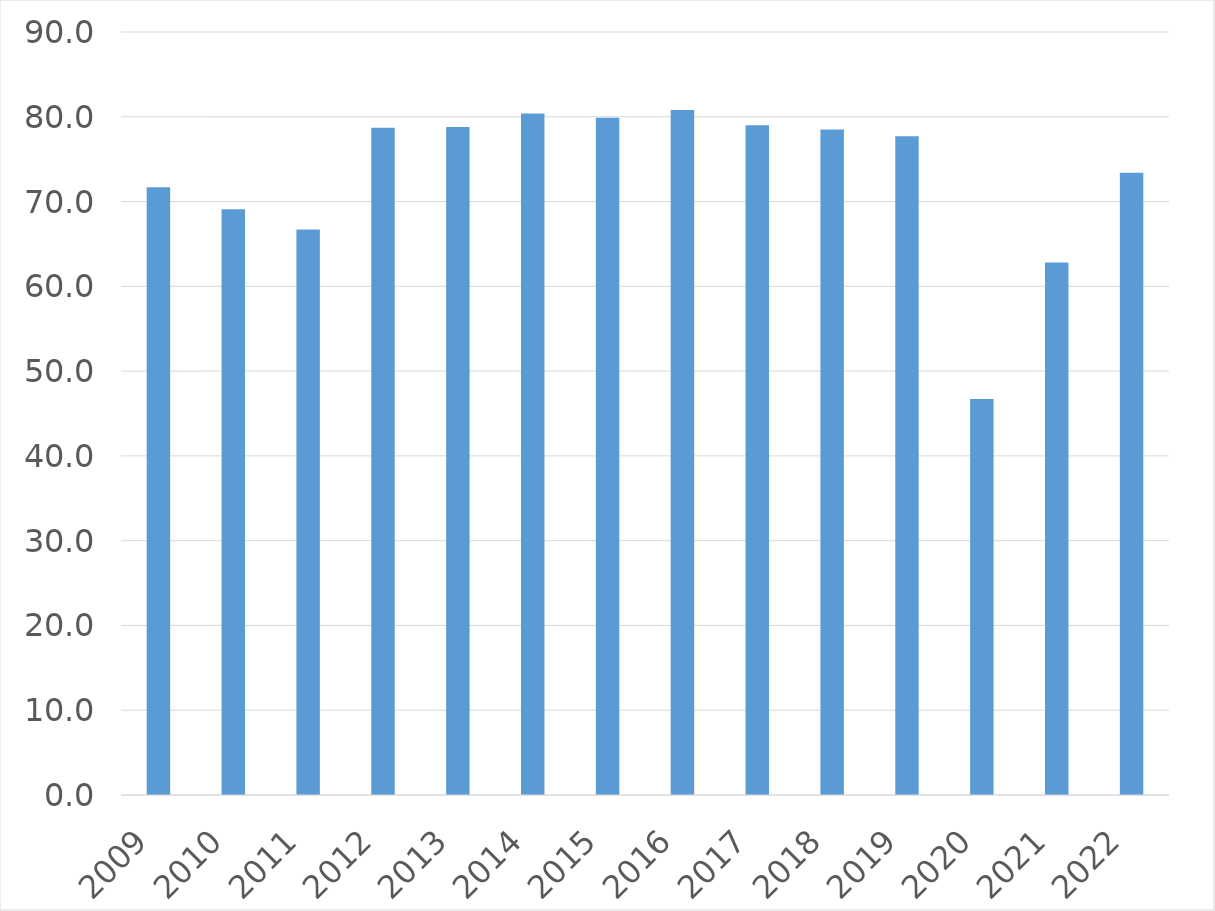
| Category | Series 0 |
|---|---|
| 2009 | 71.7 |
| 2010 | 69.1 |
| 2011 | 66.7 |
| 2012 | 78.7 |
| 2013 | 78.8 |
| 2014 | 80.4 |
| 2015 | 79.9 |
| 2016 | 80.8 |
| 2017 | 79 |
| 2018 | 78.5 |
| 2019 | 77.7 |
| 2020 | 46.7 |
| 2021 | 62.8 |
| 2022 | 73.4 |